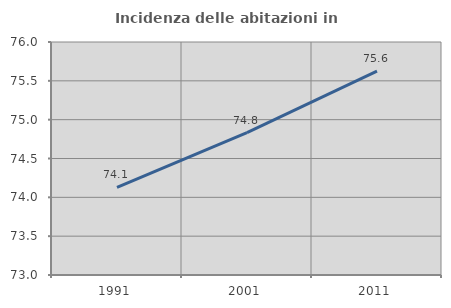
| Category | Incidenza delle abitazioni in proprietà  |
|---|---|
| 1991.0 | 74.129 |
| 2001.0 | 74.834 |
| 2011.0 | 75.625 |